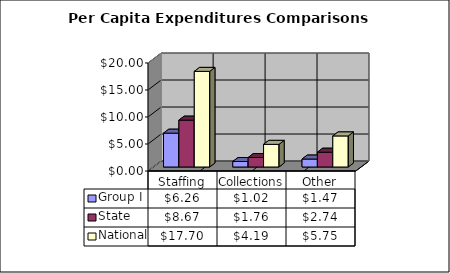
| Category | Group I | State | National |
|---|---|---|---|
| Staffing | 6.264 | 8.673 | 17.7 |
| Collections | 1.015 | 1.759 | 4.19 |
| Other | 1.472 | 2.74 | 5.75 |